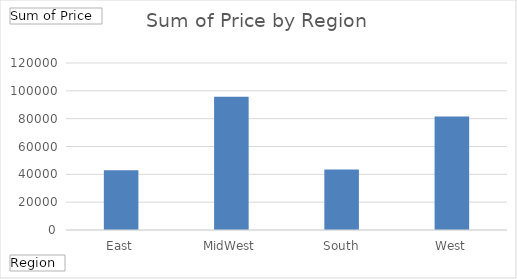
| Category | Total |
|---|---|
| East | 42981.75 |
| MidWest | 95715.96 |
| South | 43558.66 |
| West | 81485.83 |